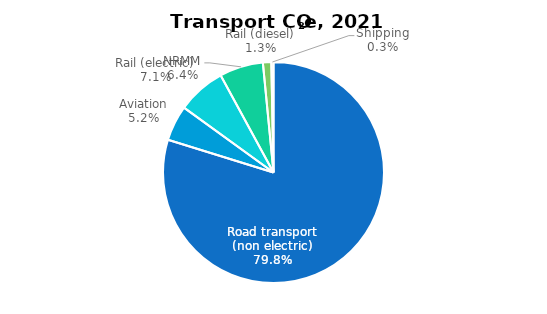
| Category | Series 0 |
|---|---|
| Road transport (non electric) | 5.671 |
| Aviation | 0.369 |
| Rail (electric) | 0.504 |
| NRMM | 0.454 |
| Rail (diesel) | 0.087 |
| Shipping | 0.022 |